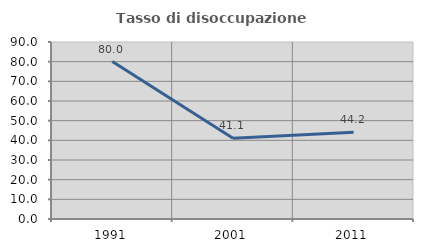
| Category | Tasso di disoccupazione giovanile  |
|---|---|
| 1991.0 | 80.046 |
| 2001.0 | 41.111 |
| 2011.0 | 44.156 |